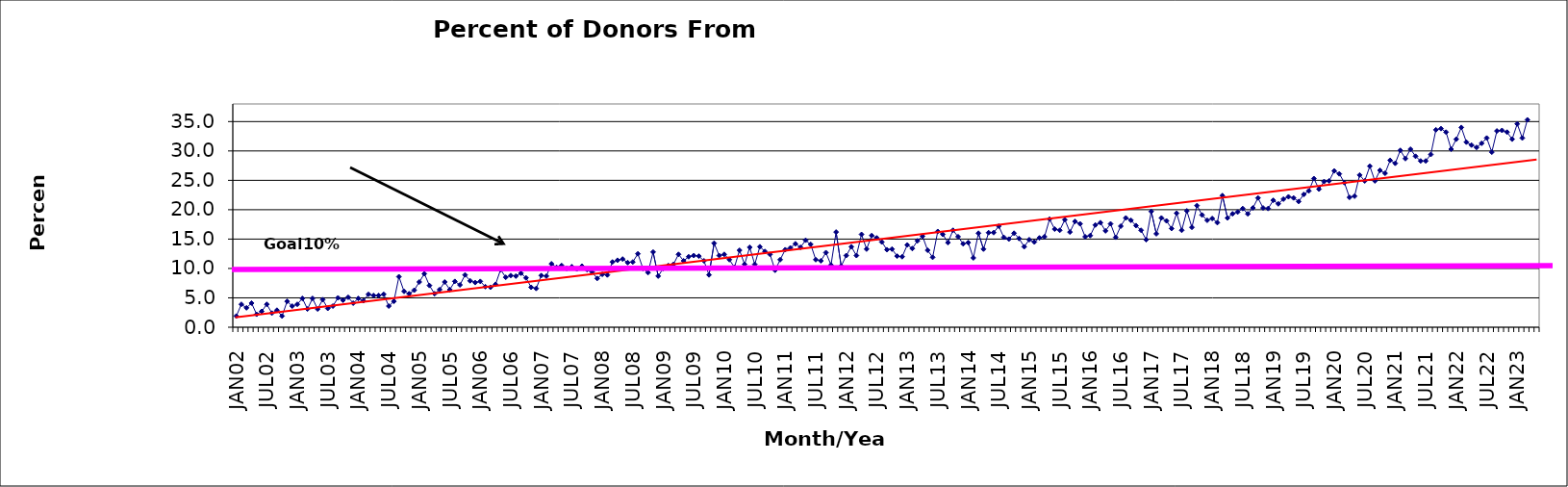
| Category | Series 0 |
|---|---|
| JAN02 | 1.9 |
| FEB02 | 3.9 |
| MAR02 | 3.3 |
| APR02 | 4.1 |
| MAY02 | 2.2 |
| JUN02 | 2.7 |
| JUL02 | 3.9 |
| AUG02 | 2.4 |
| SEP02 | 2.9 |
| OCT02 | 1.9 |
| NOV02 | 4.4 |
| DEC02 | 3.6 |
| JAN03 | 3.9 |
| FEB03 | 4.9 |
| MAR03 | 3.1 |
| APR03 | 4.9 |
| MAY03 | 3.1 |
| JUN03 | 4.7 |
| JUL03 | 3.2 |
| AUG03 | 3.6 |
| SEP03 | 5 |
| OCT03 | 4.6 |
| NOV03 | 5.1 |
| DEC03 | 4.1 |
| JAN04 | 4.9 |
| FEB04 | 4.5 |
| MAR04 | 5.6 |
| APR04 | 5.4 |
| MAY04 | 5.4 |
| JUN04 | 5.6 |
| JUL04 | 3.6 |
| AUG04 | 4.4 |
| SEP04 | 8.6 |
| OCT04 | 6.1 |
| NOV04 | 5.7 |
| DEC04 | 6.3 |
| JAN05 | 7.7 |
| FEB05 | 9.1 |
| MAR05 | 7.1 |
| APR05 | 5.7 |
| MAY05 | 6.4 |
| JUN05 | 7.7 |
| JUL05 | 6.4 |
| AUG05 | 7.8 |
| SEP05 | 7.2 |
| OCT05 | 8.9 |
| NOV05 | 7.9 |
| DEC05 | 7.6 |
| JAN06 | 7.8 |
| FEB06 | 6.9 |
| MAR06 | 6.8 |
| APR06 | 7.3 |
| MAY06 | 9.8 |
| JUN06 | 8.5 |
| JUL06 | 8.8 |
| AUG06 | 8.7 |
| SEP06 | 9.2 |
| OCT06 | 8.4 |
| NOV06 | 6.8 |
| DEC06 | 6.6 |
| JAN07 | 8.8 |
| FEB07 | 8.7 |
| MAR07 | 10.8 |
| APR07 | 10.2 |
| MAY07 | 10.5 |
| JUN07 | 10 |
| JUL07 | 10.3 |
| AUG07 | 9.9 |
| SEP07 | 10.4 |
| OCT07 | 9.8 |
| NOV07 | 9.4 |
| DEC07 | 8.3 |
| JAN08 | 9 |
| FEB08 | 8.9 |
| MAR08 | 11.1 |
| APR08 | 11.4 |
| MAY08 | 11.6 |
| JUN08 | 11 |
| JUL08 | 11.1 |
| AUG08 | 12.5 |
| SEP08 | 10 |
| OCT08 | 9.3 |
| NOV08 | 12.8 |
| DEC08 | 8.7 |
| JAN09 | 10 |
| FEB09 | 10.5 |
| MAR09 | 10.7 |
| APR09 | 12.4 |
| MAY09 | 11.3 |
| JUN09 | 12 |
| JUL09 | 12.2 |
| AUG09 | 12.1 |
| SEP09 | 11.3 |
| OCT09 | 8.9 |
| NOV09 | 14.3 |
| DEC09 | 12.2 |
| JAN10 | 12.4 |
| FEB10 | 11.5 |
| MAR10 | 10.2 |
| APR10 | 13.1 |
| MAY10 | 10.7 |
| JUN10 | 13.6 |
| JUL10 | 10.7 |
| AUG10 | 13.7 |
| SEP10 | 12.9 |
| OCT10 | 12.4 |
| NOV10 | 9.7 |
| DEC10 | 11.5 |
| JAN11 | 13.2 |
| FEB11 | 13.5 |
| MAR11 | 14.2 |
| APR11 | 13.6 |
| MAY11 | 14.8 |
| JUN11 | 14.1 |
| JUL11 | 11.5 |
| AUG11 | 11.3 |
| SEP11 | 12.7 |
| OCT11 | 10.6 |
| NOV11 | 16.2 |
| DEC11 | 10.4 |
| JAN12 | 12.2 |
| FEB12 | 13.7 |
| MAR12 | 12.2 |
| APR12 | 15.8 |
| MAY12 | 13.3 |
| JUN12 | 15.6 |
| JUL12 | 15.2 |
| AUG12 | 14.5 |
| SEP12 | 13.2 |
| OCT12 | 13.3 |
| NOV12 | 12.1 |
| DEC12 | 12 |
| JAN13 | 14 |
| FEB13 | 13.4 |
| MAR13 | 14.7 |
| APR13 | 15.5 |
| MAY13 | 13.1 |
| JUN13 | 11.9 |
| JUL13 | 16.3 |
| AUG13 | 15.8 |
| SEP13 | 14.4 |
| OCT13 | 16.5 |
| NOV13 | 15.4 |
| DEC13 | 14.2 |
| JAN14 | 14.4 |
| FEB14 | 11.8 |
| MAR14 | 16 |
| APR14 | 13.3 |
| MAY14 | 16.1 |
| JUN14 | 16.1 |
| JUL14 | 17.2 |
| AUG14 | 15.3 |
| SEP14 | 15 |
| OCT14 | 16 |
| NOV14 | 15.1 |
| DEC14 | 13.7 |
| JAN15 | 14.9 |
| FEB15 | 14.5 |
| MAR15 | 15.2 |
| APR15 | 15.4 |
| MAY15 | 18.4 |
| JUN15 | 16.7 |
| JUL15 | 16.5 |
| AUG15 | 18.3 |
| SEP15 | 16.2 |
| OCT15 | 18 |
| NOV15 | 17.6 |
| DEC15 | 15.4 |
| JAN16 | 15.6 |
| FEB16 | 17.4 |
| MAR16 | 17.8 |
| APR16 | 16.4 |
| MAY16 | 17.6 |
| JUN16 | 15.3 |
| JUL16 | 17.2 |
| AUG16 | 18.6 |
| SEP16 | 18.2 |
| OCT16 | 17.3 |
| NOV16 | 16.5 |
| DEC16 | 14.9 |
| JAN17 | 19.7 |
| FEB17 | 15.9 |
| MAR17 | 18.6 |
| APR17 | 18.1 |
| MAY17 | 16.8 |
| JUN17 | 19.4 |
| JUL17 | 16.5 |
| AUG17 | 19.8 |
| SEP17 | 17 |
| OCT17 | 20.7 |
| NOV17 | 19.1 |
| DEC17 | 18.2 |
| JAN18 | 18.5 |
| FEB18 | 17.8 |
| MAR18 | 22.4 |
| APR18 | 18.6 |
| MAY18 | 19.3 |
| JUN18 | 19.6 |
| JUL18 | 20.2 |
| AUG18 | 19.3 |
| SEP18 | 20.3 |
| OCT18 | 22 |
| NOV18 | 20.3 |
| DEC18 | 20.2 |
| JAN19 | 21.6 |
| FEB19 | 21 |
| MAR19 | 21.8 |
| APR19 | 22.2 |
| MAY19 | 22 |
| JUN19 | 21.4 |
| JUL19 | 22.6 |
| AUG19 | 23.2 |
| SEP19 | 25.3 |
| OCT19 | 23.5 |
| NOV19 | 24.8 |
| DEC19 | 24.9 |
| JAN20 | 26.6 |
| FEB20 | 26.1 |
| MAR20 | 24.6 |
| APR20 | 22.1 |
| MAY20 | 22.3 |
| JUN20 | 25.9 |
| JUL20 | 24.9 |
| AUG20 | 27.4 |
| SEP20 | 24.9 |
| OCT20 | 26.7 |
| NOV20 | 26.2 |
| DEC20 | 28.4 |
| JAN21 | 27.9 |
| FEB21 | 30.1 |
| MAR21 | 28.7 |
| APR21 | 30.3 |
| MAY21 | 29.1 |
| JUN21 | 28.3 |
| JUL21 | 28.3 |
| AUG21 | 29.4 |
| SEP21 | 33.6 |
| OCT21 | 33.8 |
| NOV21 | 33.2 |
| DEC21 | 30.3 |
| JAN22 | 32 |
| FEB22 | 34 |
| MAR22 | 31.5 |
| APR22 | 31 |
| MAY22 | 30.6 |
| JUN22 | 31.3 |
| JUL22 | 32.2 |
| AUG22 | 29.8 |
| SEP22 | 33.4 |
| OCT22 | 33.5 |
| NOV22 | 33.2 |
| DEC22 | 32 |
| JAN23 | 34.6 |
| FEB23 | 32.2 |
| MAR23 | 35.3 |